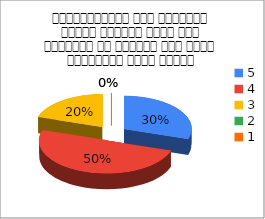
| Category | महाविद्यालय में एकेडमिक स्टाफ द्वारा आपके साथ व्यवहार के संदर्भ में अपनी संतुष्टि स्तर बताइए |
|---|---|
| 5.0 | 3 |
| 4.0 | 5 |
| 3.0 | 2 |
| 2.0 | 0 |
| 1.0 | 0 |